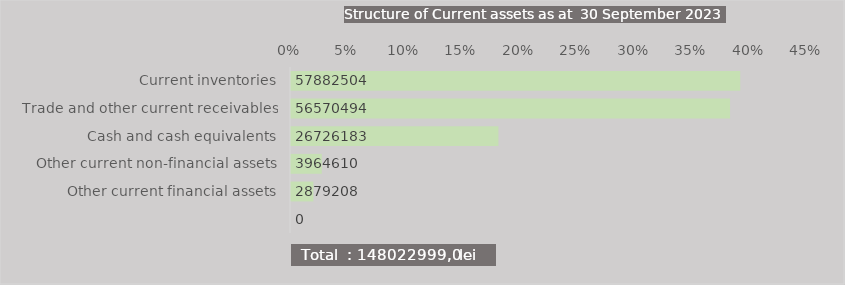
| Category | Series 0 |
|---|---|
| Current inventories | 0.391 |
| Trade and other current receivables | 0.382 |
| Cash and cash equivalents | 0.181 |
| Other current non-financial assets | 0.027 |
| Other current financial assets | 0.019 |